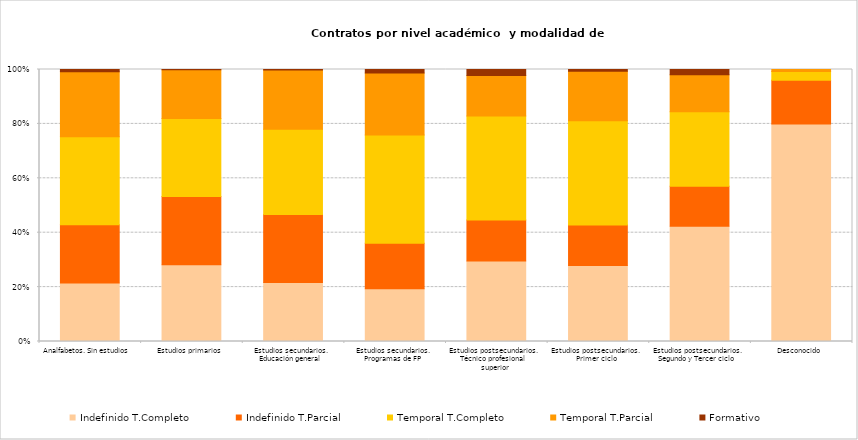
| Category | Indefinido T.Completo | Indefinido T.Parcial | Temporal T.Completo | Temporal T.Parcial | Formativo |
|---|---|---|---|---|---|
|  Analfabetos. Sin estudios | 7896 | 7876 | 11872 | 8807 | 289 |
|  Estudios primarios | 77806 | 69321 | 78922 | 49536 | 260 |
|  Estudios secundarios. Educación general | 92997 | 107282 | 134088 | 93508 | 783 |
|  Estudios secundarios. Programas de FP | 9928 | 8599 | 20359 | 11694 | 659 |
|  Estudios postsecundarios. Técnico profesional superior | 12824 | 6504 | 16594 | 6436 | 950 |
|  Estudios postsecundarios. Primer ciclo | 6509 | 3476 | 8933 | 4257 | 144 |
|  Estudios postsecundarios. Segundo y Tercer ciclo | 77303 | 26795 | 50141 | 24780 | 3494 |
|  Desconocido | 8327 | 1680 | 331 | 80 | 0 |